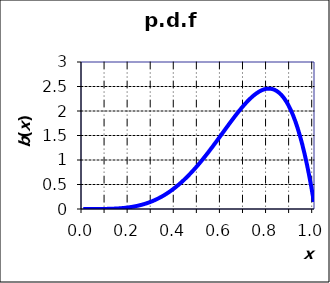
| Category | b(x) |
|---|---|
| 0.0 | 0 |
| 0.01 | 0 |
| 0.02 | 0 |
| 0.03 | 0 |
| 0.04 | 0 |
| 0.05 | 0 |
| 0.060000000000000005 | 0 |
| 0.07 | 0.001 |
| 0.08 | 0.001 |
| 0.09 | 0.001 |
| 0.09999999999999999 | 0.002 |
| 0.10999999999999999 | 0.003 |
| 0.11999999999999998 | 0.005 |
| 0.12999999999999998 | 0.006 |
| 0.13999999999999999 | 0.009 |
| 0.15 | 0.011 |
| 0.16 | 0.015 |
| 0.17 | 0.019 |
| 0.18000000000000002 | 0.023 |
| 0.19000000000000003 | 0.029 |
| 0.20000000000000004 | 0.035 |
| 0.21000000000000005 | 0.042 |
| 0.22000000000000006 | 0.05 |
| 0.23000000000000007 | 0.06 |
| 0.24000000000000007 | 0.07 |
| 0.25000000000000006 | 0.082 |
| 0.26000000000000006 | 0.095 |
| 0.2700000000000001 | 0.109 |
| 0.2800000000000001 | 0.124 |
| 0.2900000000000001 | 0.142 |
| 0.3000000000000001 | 0.16 |
| 0.3100000000000001 | 0.18 |
| 0.3200000000000001 | 0.202 |
| 0.3300000000000001 | 0.226 |
| 0.34000000000000014 | 0.251 |
| 0.35000000000000014 | 0.278 |
| 0.36000000000000015 | 0.307 |
| 0.37000000000000016 | 0.338 |
| 0.38000000000000017 | 0.371 |
| 0.3900000000000002 | 0.405 |
| 0.4000000000000002 | 0.442 |
| 0.4100000000000002 | 0.48 |
| 0.4200000000000002 | 0.521 |
| 0.4300000000000002 | 0.563 |
| 0.4400000000000002 | 0.607 |
| 0.45000000000000023 | 0.653 |
| 0.46000000000000024 | 0.701 |
| 0.47000000000000025 | 0.75 |
| 0.48000000000000026 | 0.802 |
| 0.49000000000000027 | 0.855 |
| 0.5000000000000002 | 0.91 |
| 0.5100000000000002 | 0.966 |
| 0.5200000000000002 | 1.024 |
| 0.5300000000000002 | 1.083 |
| 0.5400000000000003 | 1.143 |
| 0.5500000000000003 | 1.204 |
| 0.5600000000000003 | 1.267 |
| 0.5700000000000003 | 1.33 |
| 0.5800000000000003 | 1.394 |
| 0.5900000000000003 | 1.458 |
| 0.6000000000000003 | 1.523 |
| 0.6100000000000003 | 1.588 |
| 0.6200000000000003 | 1.652 |
| 0.6300000000000003 | 1.717 |
| 0.6400000000000003 | 1.78 |
| 0.6500000000000004 | 1.843 |
| 0.6600000000000004 | 1.905 |
| 0.6700000000000004 | 1.965 |
| 0.6800000000000004 | 2.024 |
| 0.6900000000000004 | 2.081 |
| 0.7000000000000004 | 2.135 |
| 0.7100000000000004 | 2.186 |
| 0.7200000000000004 | 2.234 |
| 0.7300000000000004 | 2.279 |
| 0.7400000000000004 | 2.32 |
| 0.7500000000000004 | 2.356 |
| 0.7600000000000005 | 2.388 |
| 0.7700000000000005 | 2.414 |
| 0.7800000000000005 | 2.435 |
| 0.7900000000000005 | 2.449 |
| 0.8000000000000005 | 2.456 |
| 0.8100000000000005 | 2.456 |
| 0.8200000000000005 | 2.448 |
| 0.8300000000000005 | 2.432 |
| 0.8400000000000005 | 2.406 |
| 0.8500000000000005 | 2.37 |
| 0.8600000000000005 | 2.324 |
| 0.8700000000000006 | 2.267 |
| 0.8800000000000006 | 2.198 |
| 0.8900000000000006 | 2.116 |
| 0.9000000000000006 | 2.021 |
| 0.9100000000000006 | 1.911 |
| 0.9200000000000006 | 1.787 |
| 0.9300000000000006 | 1.647 |
| 0.9400000000000006 | 1.49 |
| 0.9500000000000006 | 1.315 |
| 0.9600000000000006 | 1.122 |
| 0.9700000000000006 | 0.91 |
| 0.9800000000000006 | 0.677 |
| 0.9900000000000007 | 0.423 |
| 1.0000000000000007 | 0.146 |